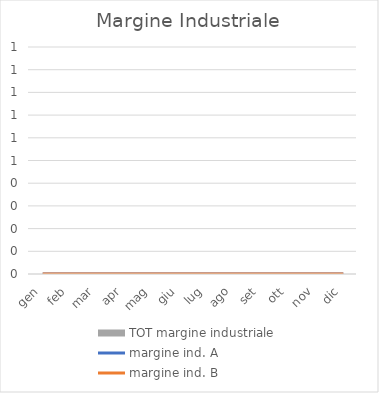
| Category | TOT margine industriale |
|---|---|
| gen | 0 |
| feb | 0 |
| mar | 0 |
| apr | 0 |
| mag | 0 |
| giu | 0 |
| lug | 0 |
| ago | 0 |
| set | 0 |
| ott | 0 |
| nov | 0 |
| dic | 0 |